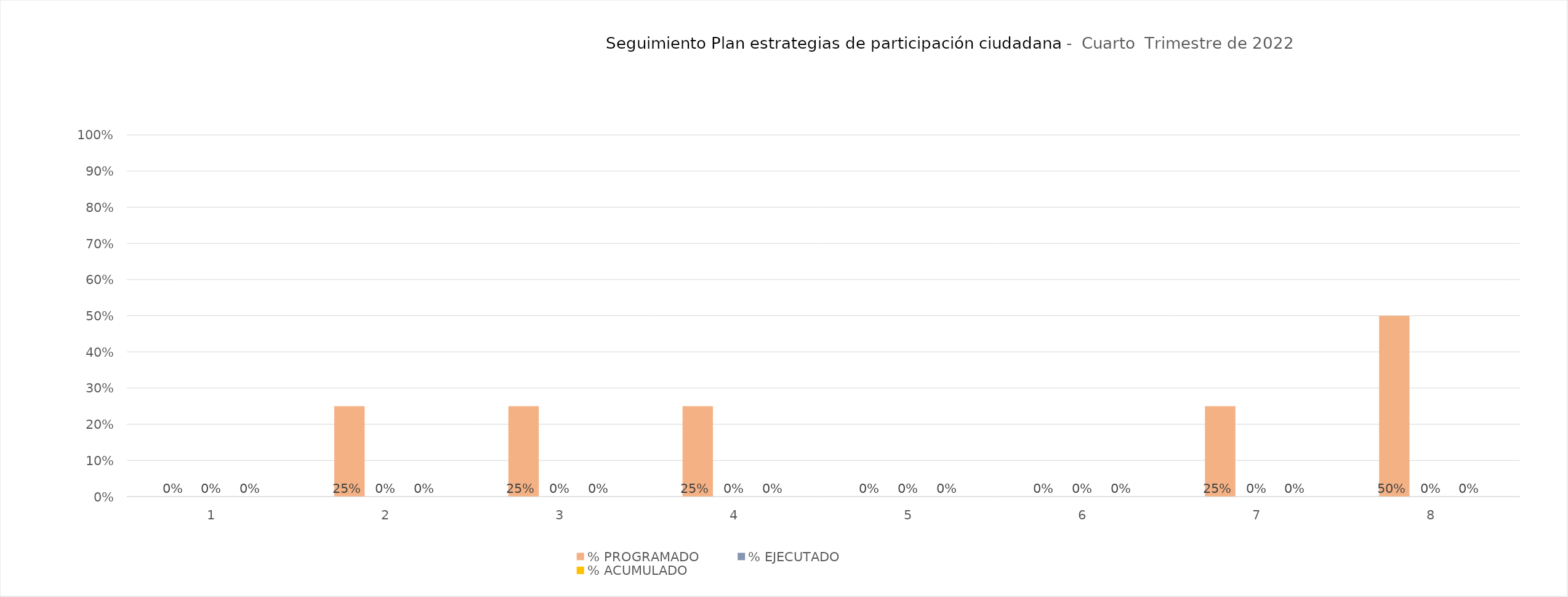
| Category | % PROGRAMADO | % EJECUTADO | % ACUMULADO |
|---|---|---|---|
| 1.0 | 0 | 0 | 0 |
| 2.0 | 0.25 | 0 | 0 |
| 3.0 | 0.25 | 0 | 0 |
| 4.0 | 0.25 | 0 | 0 |
| 5.0 | 0 | 0 | 0 |
| 6.0 | 0 | 0 | 0 |
| 7.0 | 0.25 | 0 | 0 |
| 8.0 | 0.5 | 0 | 0 |